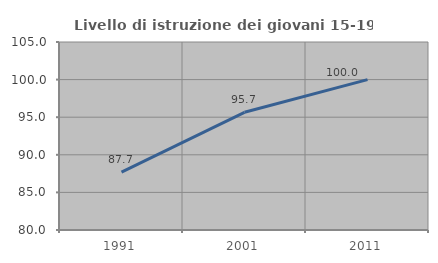
| Category | Livello di istruzione dei giovani 15-19 anni |
|---|---|
| 1991.0 | 87.692 |
| 2001.0 | 95.652 |
| 2011.0 | 100 |